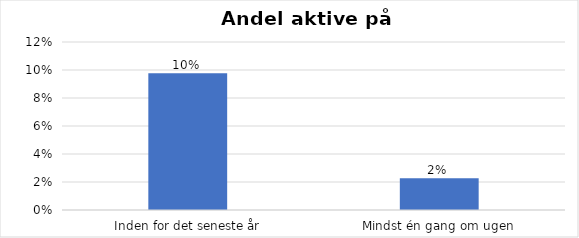
| Category | % |
|---|---|
| Inden for det seneste år | 0.098 |
| Mindst én gang om ugen | 0.023 |